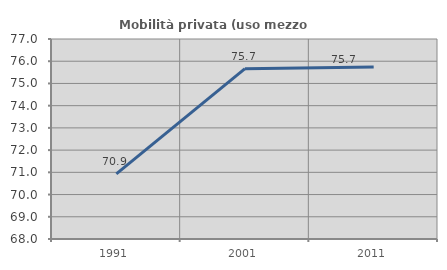
| Category | Mobilità privata (uso mezzo privato) |
|---|---|
| 1991.0 | 70.931 |
| 2001.0 | 75.666 |
| 2011.0 | 75.742 |